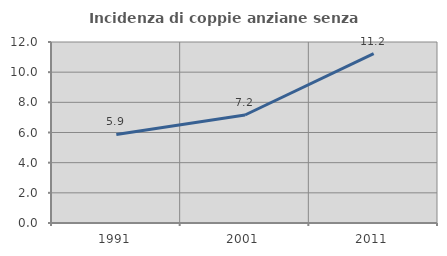
| Category | Incidenza di coppie anziane senza figli  |
|---|---|
| 1991.0 | 5.874 |
| 2001.0 | 7.161 |
| 2011.0 | 11.226 |